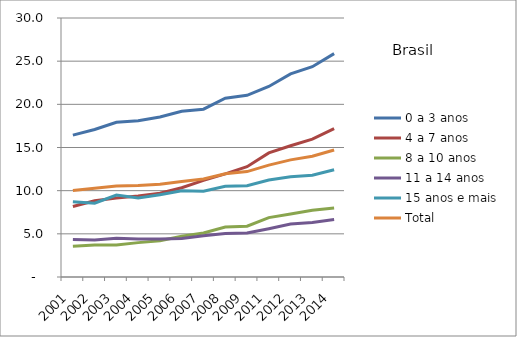
| Category | 0 a 3 anos | 4 a 7 anos | 8 a 10 anos | 11 a 14 anos | 15 anos e mais | Total |
|---|---|---|---|---|---|---|
| 2001.0 | 16.437 | 8.172 | 3.565 | 4.35 | 8.717 | 10.017 |
| 2002.0 | 17.084 | 8.836 | 3.71 | 4.289 | 8.555 | 10.272 |
| 2003.0 | 17.927 | 9.138 | 3.702 | 4.484 | 9.493 | 10.539 |
| 2004.0 | 18.096 | 9.385 | 3.982 | 4.406 | 9.139 | 10.605 |
| 2005.0 | 18.542 | 9.694 | 4.211 | 4.409 | 9.536 | 10.75 |
| 2006.0 | 19.19 | 10.344 | 4.727 | 4.456 | 9.987 | 11.05 |
| 2007.0 | 19.437 | 11.192 | 5.101 | 4.775 | 9.937 | 11.362 |
| 2008.0 | 20.713 | 11.95 | 5.785 | 5.044 | 10.503 | 11.96 |
| 2009.0 | 21.045 | 12.774 | 5.889 | 5.11 | 10.581 | 12.212 |
| 2011.0 | 22.073 | 14.376 | 6.881 | 5.6 | 11.226 | 12.962 |
| 2012.0 | 23.525 | 15.203 | 7.295 | 6.144 | 11.606 | 13.569 |
| 2013.0 | 24.355 | 15.97 | 7.738 | 6.316 | 11.79 | 13.982 |
| 2014.0 | 25.87 | 17.185 | 7.993 | 6.661 | 12.431 | 14.712 |